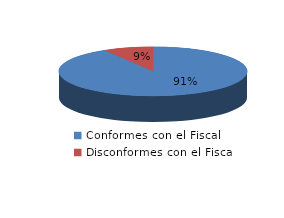
| Category | Series 0 |
|---|---|
| 0 | 43 |
| 1 | 4 |